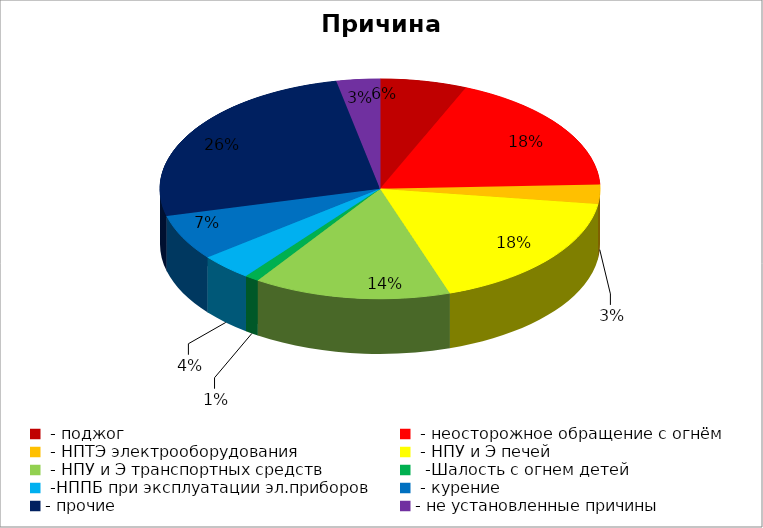
| Category | Причина пожара |
|---|---|
|  - поджог | 18 |
|  - неосторожное обращение с огнём | 51 |
|  - НПТЭ электрооборудования | 8 |
|  - НПУ и Э печей | 50 |
|  - НПУ и Э транспортных средств | 41 |
|   -Шалость с огнем детей | 3 |
|  -НППБ при эксплуатации эл.приборов | 11 |
|  - курение | 19 |
| - прочие | 73 |
| - не установленные причины | 9 |